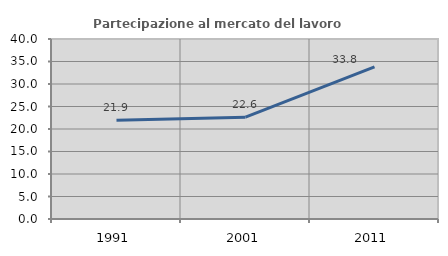
| Category | Partecipazione al mercato del lavoro  femminile |
|---|---|
| 1991.0 | 21.918 |
| 2001.0 | 22.619 |
| 2011.0 | 33.824 |